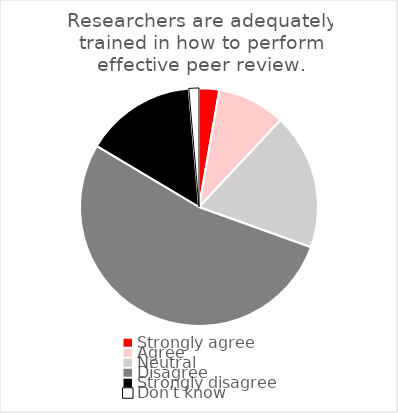
| Category | Researchers are adequately trained in how to perform effective peer review. |
|---|---|
| Strongly agree | 8 |
| Agree | 27 |
| Neutral | 54 |
| Disagree | 155 |
| Strongly disagree | 44 |
| Don't know | 4 |